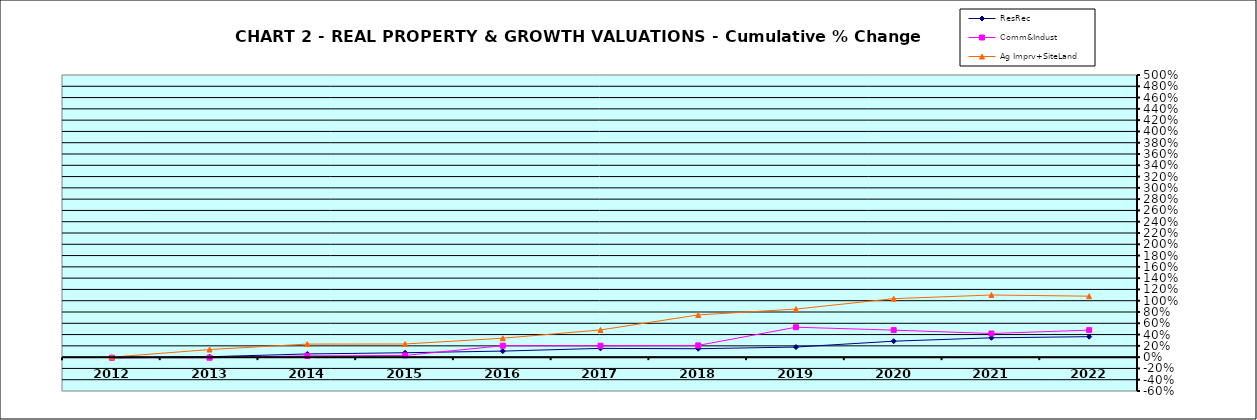
| Category | ResRec | Comm&Indust | Ag Imprv+SiteLand |
|---|---|---|---|
| 2012.0 | -0.014 | -0.011 | 0 |
| 2013.0 | 0.007 | -0.01 | 0.135 |
| 2014.0 | 0.056 | 0.022 | 0.231 |
| 2015.0 | 0.078 | 0.03 | 0.233 |
| 2016.0 | 0.107 | 0.203 | 0.335 |
| 2017.0 | 0.155 | 0.202 | 0.482 |
| 2018.0 | 0.149 | 0.208 | 0.748 |
| 2019.0 | 0.179 | 0.53 | 0.852 |
| 2020.0 | 0.283 | 0.479 | 1.036 |
| 2021.0 | 0.342 | 0.419 | 1.101 |
| 2022.0 | 0.363 | 0.479 | 1.08 |